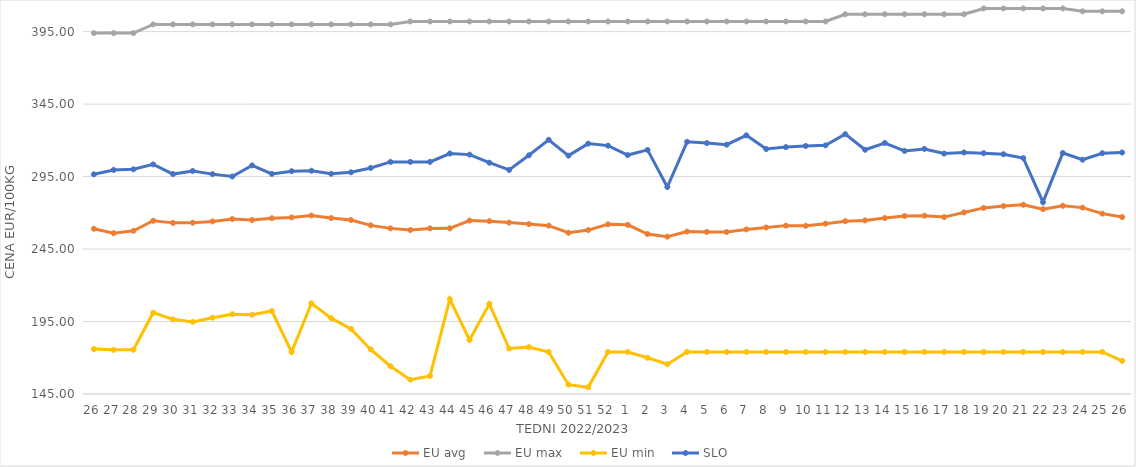
| Category | EU avg | EU max | EU min | SLO |
|---|---|---|---|---|
| 26.0 | 259.018 | 394 | 176 | 296.56 |
| 27.0 | 255.922 | 394 | 175.451 | 299.59 |
| 28.0 | 257.564 | 394 | 175.52 | 300.01 |
| 29.0 | 264.52 | 400 | 201.097 | 303.41 |
| 30.0 | 263.067 | 400 | 196.496 | 296.73 |
| 31.0 | 263.196 | 400 | 194.756 | 298.88 |
| 32.0 | 264.059 | 400 | 197.634 | 296.7 |
| 33.0 | 265.729 | 400 | 200.07 | 295.05 |
| 34.0 | 265.016 | 400 | 199.637 | 302.73 |
| 35.0 | 266.273 | 400 | 202.277 | 296.86 |
| 36.0 | 266.807 | 400 | 174 | 298.7 |
| 37.0 | 268.136 | 400 | 207.594 | 299.02 |
| 38.0 | 266.39 | 400 | 197.352 | 296.91 |
| 39.0 | 265.059 | 400 | 189.926 | 297.96 |
| 40.0 | 261.35 | 400 | 175.723 | 300.95 |
| 41.0 | 259.271 | 400 | 164.165 | 305.13 |
| 42.0 | 258.146 | 402 | 154.869 | 305.13 |
| 43.0 | 259.256 | 402 | 157.459 | 305.13 |
| 44.0 | 259.32 | 402 | 210.415 | 310.93 |
| 45.0 | 264.649 | 402 | 182.35 | 310.16 |
| 46.0 | 264.228 | 402 | 207.247 | 304.58 |
| 47.0 | 263.24 | 402 | 176.378 | 299.59 |
| 48.0 | 262.225 | 402 | 177.332 | 309.69 |
| 49.0 | 261.152 | 402 | 174 | 320.38 |
| 50.0 | 256.24 | 402 | 151.434 | 309.44 |
| 51.0 | 258.071 | 402 | 149.638 | 317.74 |
| 52.0 | 262.088 | 402 | 174 | 316.36 |
| 1.0 | 261.716 | 402 | 174 | 309.84 |
| 2.0 | 255.331 | 402 | 169.983 | 313.4 |
| 3.0 | 253.546 | 402 | 165.574 | 287.81 |
| 4.0 | 257.051 | 402 | 174 | 318.98 |
| 5.0 | 256.808 | 402 | 174 | 318.13 |
| 6.0 | 256.75 | 402 | 174 | 316.99 |
| 7.0 | 258.565 | 402 | 174 | 323.47 |
| 8.0 | 259.872 | 402 | 174 | 314 |
| 9.0 | 261.164 | 402 | 174 | 315.35 |
| 10.0 | 261.06 | 402 | 174 | 316.13 |
| 11.0 | 262.513 | 402 | 174 | 316.55 |
| 12.0 | 264.228 | 407 | 174 | 324.27 |
| 13.0 | 264.768 | 407 | 174 | 313.49 |
| 14.0 | 266.385 | 407 | 174 | 318.17 |
| 15.0 | 267.797 | 407 | 174 | 312.7 |
| 16.0 | 268.021 | 407 | 174 | 314.07 |
| 17.0 | 267.041 | 407 | 174 | 310.87 |
| 18.0 | 270.255 | 407 | 174 | 311.69 |
| 19.0 | 273.406 | 411 | 174 | 311.13 |
| 20.0 | 274.631 | 411 | 174 | 310.42 |
| 21.0 | 275.561 | 411 | 174 | 307.76 |
| 22.0 | 272.542 | 411 | 174 | 277.34 |
| 23.0 | 274.85 | 411 | 174 | 311.28 |
| 24.0 | 273.59 | 409 | 174 | 306.64 |
| 25.0 | 269.439 | 409 | 174 | 311.1 |
| 26.0 | 267.06 | 409 | 167.858 | 311.62 |